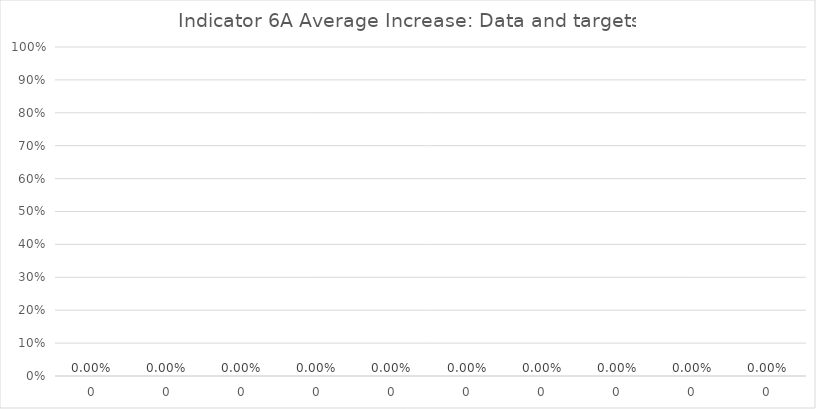
| Category | Indicator 6A data and targets |
|---|---|
| 0.0 | 0 |
| 0.0 | 0 |
| 0.0 | 0 |
| 0.0 | 0 |
| 0.0 | 0 |
| 0.0 | 0 |
| 0.0 | 0 |
| 0.0 | 0 |
| 0.0 | 0 |
| 0.0 | 0 |